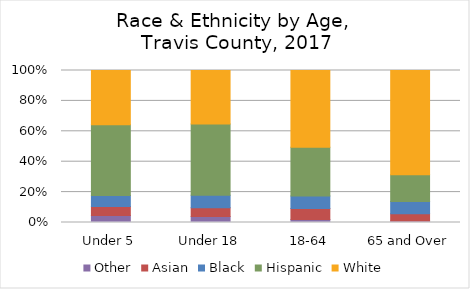
| Category | Other | Asian | Black | Hispanic | White |
|---|---|---|---|---|---|
| Under 5 | 0.045 | 0.06 | 0.072 | 0.465 | 0.357 |
| Under 18 | 0.039 | 0.059 | 0.082 | 0.468 | 0.352 |
| 18-64 | 0.019 | 0.073 | 0.083 | 0.32 | 0.504 |
| 65 and Over | 0.009 | 0.048 | 0.081 | 0.176 | 0.685 |